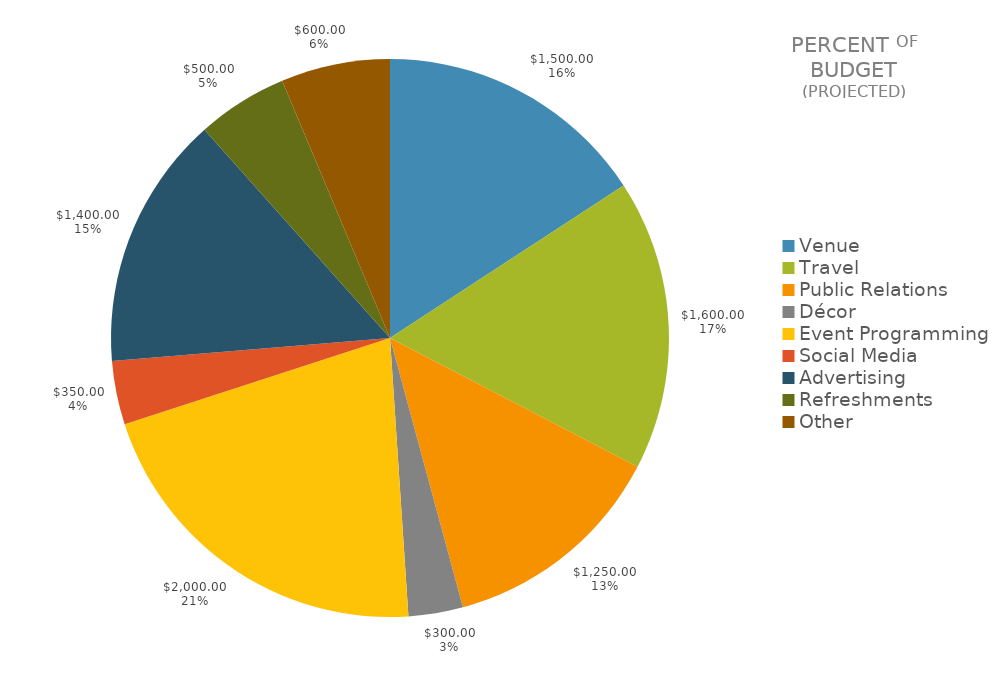
| Category | Series 0 | Series 1 |
|---|---|---|
| Venue | 1500 | 0.158 |
| Travel | 1600 | 0.168 |
| Public Relations | 1250 | 0.132 |
| Décor | 300 | 0.032 |
| Event Programming | 2000 | 0.211 |
| Social Media | 350 | 0.037 |
| Advertising | 1400 | 0.147 |
| Refreshments | 500 | 0.053 |
| Other | 600 | 0.063 |